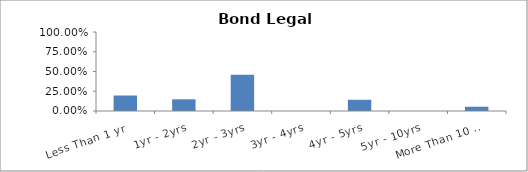
| Category | Series 0 |
|---|---|
| Less Than 1 yr | 0.196 |
| 1yr - 2yrs | 0.148 |
| 2yr - 3yrs | 0.46 |
| 3yr - 4yrs | 0 |
| 4yr - 5yrs | 0.142 |
| 5yr - 10yrs | 0 |
| More Than 10 yrs | 0.054 |